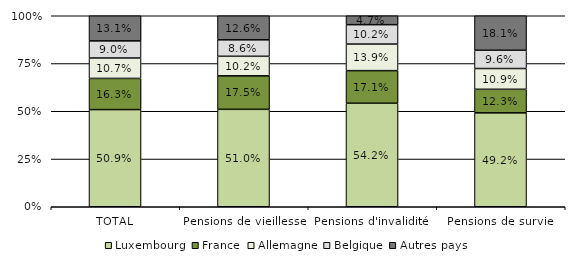
| Category | Luxembourg | France | Allemagne | Belgique | Autres pays |
|---|---|---|---|---|---|
| TOTAL | 0.509 | 0.163 | 0.107 | 0.09 | 0.131 |
| Pensions de vieillesse | 0.51 | 0.175 | 0.102 | 0.086 | 0.126 |
| Pensions d'invalidité  | 0.542 | 0.171 | 0.139 | 0.102 | 0.047 |
| Pensions de survie  | 0.492 | 0.123 | 0.109 | 0.096 | 0.181 |